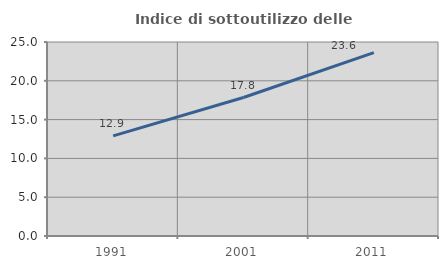
| Category | Indice di sottoutilizzo delle abitazioni  |
|---|---|
| 1991.0 | 12.905 |
| 2001.0 | 17.844 |
| 2011.0 | 23.631 |